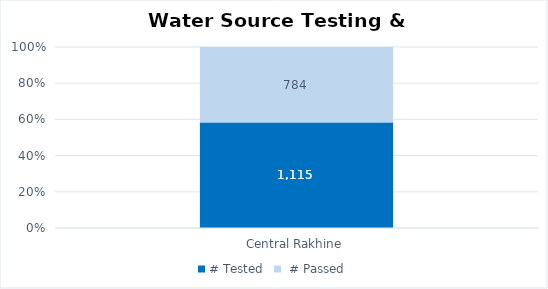
| Category | # Tested |  # Passed |
|---|---|---|
| Central Rakhine | 1115 | 784 |